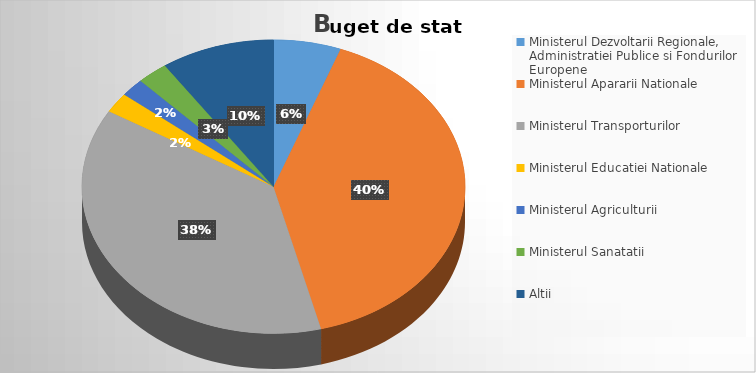
| Category | Series 0 |
|---|---|
| Ministerul Dezvoltarii Regionale, Administratiei Publice si Fondurilor Europene | 5.687 |
| Ministerul Apararii Nationale | 40.321 |
| Ministerul Transporturilor | 37.569 |
| Ministerul Educatiei Nationale | 2.218 |
| Ministerul Agriculturii | 2.001 |
| Ministerul Sanatatii | 2.613 |
| Altii | 9.592 |